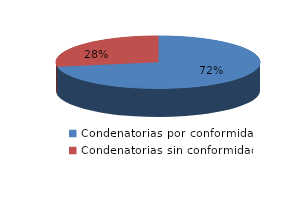
| Category | Series 0 |
|---|---|
| 0 | 201 |
| 1 | 77 |